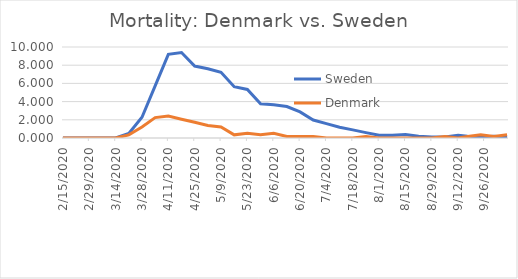
| Category | Sweden | Denmark |
|---|---|---|
| 2/15/20 | 0 | 0 |
| 2/22/20 | 0 | 0 |
| 2/29/20 | 0 | 0 |
| 3/7/20 | 0 | 0 |
| 3/14/20 | 0 | 0 |
| 3/21/20 | 0.494 | 0.345 |
| 3/28/20 | 2.274 | 1.207 |
| 4/4/20 | 5.735 | 2.242 |
| 4/11/20 | 9.196 | 2.415 |
| 4/18/20 | 9.394 | 2.07 |
| 4/25/20 | 7.911 | 1.725 |
| 5/2/20 | 7.614 | 1.38 |
| 5/9/20 | 7.218 | 1.207 |
| 5/16/20 | 5.636 | 0.345 |
| 5/23/20 | 5.34 | 0.517 |
| 5/30/20 | 3.758 | 0.345 |
| 6/6/20 | 3.659 | 0.517 |
| 6/13/20 | 3.461 | 0.172 |
| 6/20/20 | 2.868 | 0.172 |
| 6/27/20 | 1.978 | 0.172 |
| 7/4/20 | 1.582 | 0 |
| 7/11/20 | 1.187 | 0 |
| 7/18/20 | 0.89 | 0 |
| 7/25/20 | 0.593 | 0.172 |
| 8/1/20 | 0.297 | 0 |
| 8/8/20 | 0.297 | 0 |
| 8/15/20 | 0.396 | 0 |
| 8/22/20 | 0.198 | 0 |
| 8/29/20 | 0.099 | 0 |
| 9/5/20 | 0.099 | 0.172 |
| 9/12/20 | 0.297 | 0 |
| 9/17/20 | 0.198 | 0.172 |
| 9/24/20 | 0.099 | 0.345 |
| 10/1/20 | 0.198 | 0.172 |
| 10/8/20 | 0.099 | 0.345 |